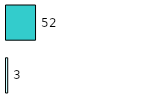
| Category | Series 0 | Series 1 |
|---|---|---|
| 0 | 3 | 52 |